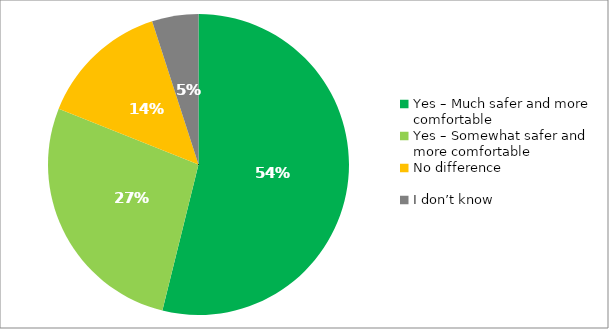
| Category | Responses |
|---|---|
| Yes – Much safer and more comfortable | 0.539 |
| Yes – Somewhat safer and more comfortable | 0.272 |
| No difference | 0.14 |
| I don’t know | 0.05 |